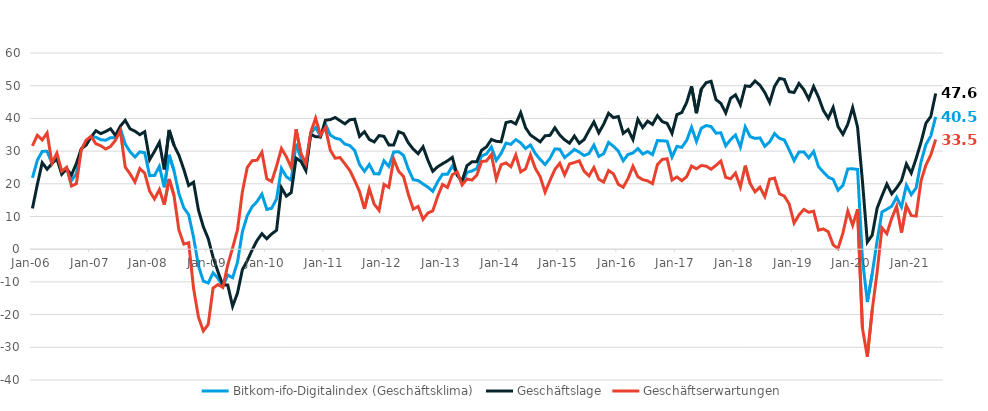
| Category | Bitkom-ifo-Digitalindex (Geschäftsklima) | Geschäftslage | Geschäftserwartungen |
|---|---|---|---|
| 2006-01-01 | 21.835 | 12.473 | 31.609 |
| 2006-02-01 | 27.19 | 19.772 | 34.858 |
| 2006-03-01 | 29.904 | 26.455 | 33.406 |
| 2006-04-01 | 29.942 | 24.458 | 35.56 |
| 2006-05-01 | 26.259 | 26.184 | 26.334 |
| 2006-06-01 | 28.531 | 27.687 | 29.379 |
| 2006-07-01 | 23.386 | 22.924 | 23.85 |
| 2006-08-01 | 24.801 | 24.56 | 25.043 |
| 2006-09-01 | 21.018 | 22.723 | 19.325 |
| 2006-10-01 | 23.101 | 26.219 | 20.027 |
| 2006-11-01 | 30.547 | 30.712 | 30.381 |
| 2006-12-01 | 32.579 | 31.825 | 33.335 |
| 2007-01-01 | 34.421 | 34.317 | 34.525 |
| 2007-02-01 | 34.228 | 36.231 | 32.242 |
| 2007-03-01 | 33.485 | 35.345 | 31.639 |
| 2007-04-01 | 33.302 | 35.999 | 30.636 |
| 2007-05-01 | 34.109 | 36.829 | 31.42 |
| 2007-06-01 | 34.046 | 34.776 | 33.318 |
| 2007-07-01 | 36.924 | 37.63 | 36.221 |
| 2007-08-01 | 32.166 | 39.412 | 25.14 |
| 2007-09-01 | 29.803 | 36.797 | 23.017 |
| 2007-10-01 | 28.191 | 36.088 | 20.559 |
| 2007-11-01 | 29.78 | 35.018 | 24.658 |
| 2007-12-01 | 29.488 | 35.916 | 23.236 |
| 2008-01-01 | 22.494 | 27.352 | 17.739 |
| 2008-02-01 | 22.526 | 29.926 | 15.364 |
| 2008-03-01 | 25.344 | 32.676 | 18.244 |
| 2008-04-01 | 18.934 | 24.405 | 13.597 |
| 2008-05-01 | 28.847 | 36.456 | 21.483 |
| 2008-06-01 | 23.96 | 31.775 | 16.409 |
| 2008-07-01 | 17.006 | 28.757 | 5.859 |
| 2008-08-01 | 12.678 | 24.421 | 1.55 |
| 2008-09-01 | 10.539 | 19.483 | 1.959 |
| 2008-10-01 | 3.619 | 20.493 | -11.963 |
| 2008-11-01 | -5.067 | 11.976 | -20.74 |
| 2008-12-01 | -9.739 | 6.87 | -25.014 |
| 2009-01-01 | -10.338 | 3.254 | -23.021 |
| 2009-02-01 | -7.23 | -2.468 | -11.877 |
| 2009-03-01 | -8.882 | -6.932 | -10.812 |
| 2009-04-01 | -11.3 | -10.911 | -11.689 |
| 2009-05-01 | -7.906 | -10.933 | -4.83 |
| 2009-06-01 | -8.735 | -17.455 | 0.401 |
| 2009-07-01 | -3.97 | -13.403 | 5.94 |
| 2009-08-01 | 5.319 | -6.24 | 17.567 |
| 2009-09-01 | 10.255 | -3.522 | 24.997 |
| 2009-10-01 | 12.984 | -0.229 | 27.071 |
| 2009-11-01 | 14.583 | 2.667 | 27.201 |
| 2009-12-01 | 16.845 | 4.732 | 29.675 |
| 2010-01-01 | 12.166 | 3.185 | 21.543 |
| 2010-02-01 | 12.529 | 4.662 | 20.7 |
| 2010-03-01 | 15.367 | 5.8 | 25.377 |
| 2010-04-01 | 24.722 | 18.815 | 30.788 |
| 2010-05-01 | 22.17 | 16.218 | 28.284 |
| 2010-06-01 | 21.112 | 17.296 | 24.996 |
| 2010-07-01 | 32.216 | 27.856 | 36.659 |
| 2010-08-01 | 28.032 | 26.828 | 29.243 |
| 2010-09-01 | 25.118 | 24.028 | 26.213 |
| 2010-10-01 | 35.434 | 35.137 | 35.732 |
| 2010-11-01 | 37.221 | 34.391 | 40.084 |
| 2010-12-01 | 34.585 | 34.329 | 34.841 |
| 2011-01-01 | 38.31 | 39.43 | 37.194 |
| 2011-02-01 | 34.934 | 39.635 | 30.325 |
| 2011-03-01 | 33.974 | 40.274 | 27.839 |
| 2011-04-01 | 33.595 | 39.307 | 28.019 |
| 2011-05-01 | 32.138 | 38.34 | 26.097 |
| 2011-06-01 | 31.713 | 39.578 | 24.106 |
| 2011-07-01 | 30.209 | 39.758 | 21.041 |
| 2011-08-01 | 25.887 | 34.498 | 17.592 |
| 2011-09-01 | 23.815 | 35.923 | 12.329 |
| 2011-10-01 | 25.903 | 33.569 | 18.488 |
| 2011-11-01 | 23.077 | 32.795 | 13.764 |
| 2011-12-01 | 23.019 | 34.75 | 11.875 |
| 2012-01-01 | 27.044 | 34.5 | 19.825 |
| 2012-02-01 | 25.307 | 31.893 | 18.908 |
| 2012-03-01 | 29.716 | 31.901 | 27.551 |
| 2012-04-01 | 29.81 | 35.935 | 23.844 |
| 2012-05-01 | 28.698 | 35.352 | 22.233 |
| 2012-06-01 | 24.483 | 32.505 | 16.738 |
| 2012-07-01 | 21.24 | 30.598 | 12.262 |
| 2012-08-01 | 21 | 29.224 | 13.07 |
| 2012-09-01 | 19.95 | 31.313 | 9.145 |
| 2012-10-01 | 18.99 | 27.207 | 11.07 |
| 2012-11-01 | 17.693 | 23.816 | 11.739 |
| 2012-12-01 | 20.636 | 25.215 | 16.151 |
| 2013-01-01 | 22.948 | 26.138 | 19.804 |
| 2013-02-01 | 22.902 | 27.01 | 18.867 |
| 2013-03-01 | 25.418 | 28.082 | 22.785 |
| 2013-04-01 | 23.115 | 22.597 | 23.634 |
| 2013-05-01 | 20.27 | 20.878 | 19.664 |
| 2013-06-01 | 23.5 | 25.543 | 21.476 |
| 2013-07-01 | 23.909 | 26.707 | 21.145 |
| 2013-08-01 | 24.647 | 26.736 | 22.578 |
| 2013-09-01 | 28.525 | 30.257 | 26.806 |
| 2013-10-01 | 29.136 | 31.304 | 26.989 |
| 2013-11-01 | 31.241 | 33.564 | 28.94 |
| 2013-12-01 | 27.155 | 33 | 21.457 |
| 2014-01-01 | 29.325 | 32.846 | 25.858 |
| 2014-02-01 | 32.46 | 38.717 | 26.367 |
| 2014-03-01 | 32.047 | 39.074 | 25.226 |
| 2014-04-01 | 33.516 | 38.313 | 28.817 |
| 2014-05-01 | 32.523 | 41.758 | 23.642 |
| 2014-06-01 | 30.781 | 37.156 | 24.577 |
| 2014-07-01 | 31.878 | 34.923 | 28.873 |
| 2014-08-01 | 29.255 | 33.889 | 24.713 |
| 2014-09-01 | 27.428 | 32.824 | 22.158 |
| 2014-10-01 | 25.899 | 34.682 | 17.444 |
| 2014-11-01 | 27.802 | 34.811 | 21.001 |
| 2014-12-01 | 30.66 | 37.128 | 24.368 |
| 2015-01-01 | 30.57 | 34.951 | 26.271 |
| 2015-02-01 | 28.035 | 33.465 | 22.731 |
| 2015-03-01 | 29.221 | 32.416 | 26.071 |
| 2015-04-01 | 30.515 | 34.605 | 26.497 |
| 2015-05-01 | 29.685 | 32.371 | 27.031 |
| 2015-06-01 | 28.631 | 33.541 | 23.824 |
| 2015-07-01 | 29.262 | 36.309 | 22.425 |
| 2015-08-01 | 31.844 | 38.923 | 24.975 |
| 2015-09-01 | 28.376 | 35.587 | 21.385 |
| 2015-10-01 | 29.21 | 38.228 | 20.535 |
| 2015-11-01 | 32.657 | 41.569 | 24.073 |
| 2015-12-01 | 31.469 | 40.224 | 23.034 |
| 2016-01-01 | 29.975 | 40.576 | 19.841 |
| 2016-02-01 | 27.038 | 35.423 | 18.952 |
| 2016-03-01 | 28.982 | 36.578 | 21.63 |
| 2016-04-01 | 29.421 | 33.541 | 25.374 |
| 2016-05-01 | 30.788 | 39.725 | 22.184 |
| 2016-06-01 | 29.094 | 37.202 | 21.263 |
| 2016-07-01 | 29.849 | 39.156 | 20.904 |
| 2016-08-01 | 28.92 | 38.156 | 20.042 |
| 2016-09-01 | 33.212 | 40.829 | 25.835 |
| 2016-10-01 | 33.159 | 39.01 | 27.451 |
| 2016-11-01 | 33.01 | 38.475 | 27.671 |
| 2016-12-01 | 28.172 | 35.434 | 21.134 |
| 2017-01-01 | 31.43 | 41.152 | 22.1 |
| 2017-02-01 | 31.14 | 41.807 | 20.944 |
| 2017-03-01 | 33.265 | 44.902 | 22.181 |
| 2017-04-01 | 37.294 | 49.79 | 25.423 |
| 2017-05-01 | 32.943 | 41.597 | 24.599 |
| 2017-06-01 | 36.999 | 48.969 | 25.605 |
| 2017-07-01 | 37.809 | 50.922 | 25.381 |
| 2017-08-01 | 37.53 | 51.352 | 24.469 |
| 2017-09-01 | 35.482 | 45.767 | 25.627 |
| 2017-10-01 | 35.61 | 44.592 | 26.957 |
| 2017-11-01 | 31.619 | 41.699 | 21.958 |
| 2017-12-01 | 33.525 | 46.15 | 21.548 |
| 2018-01-01 | 34.938 | 47.203 | 23.282 |
| 2018-02-01 | 31.247 | 44.159 | 19.017 |
| 2018-03-01 | 37.437 | 49.947 | 25.553 |
| 2018-04-01 | 34.443 | 49.775 | 20.052 |
| 2018-05-01 | 33.881 | 51.452 | 17.537 |
| 2018-06-01 | 34.036 | 50.148 | 18.962 |
| 2018-07-01 | 31.465 | 47.931 | 16.093 |
| 2018-08-01 | 32.834 | 44.84 | 21.416 |
| 2018-09-01 | 35.363 | 49.8 | 21.761 |
| 2018-10-01 | 33.915 | 52.235 | 16.926 |
| 2018-11-01 | 33.393 | 51.91 | 16.238 |
| 2018-12-01 | 30.363 | 48.169 | 13.835 |
| 2019-01-01 | 27.084 | 47.924 | 7.996 |
| 2019-02-01 | 29.7 | 50.677 | 10.478 |
| 2019-03-01 | 29.762 | 48.805 | 12.177 |
| 2019-04-01 | 27.943 | 45.916 | 11.284 |
| 2019-05-01 | 29.898 | 49.744 | 11.63 |
| 2019-06-01 | 25.241 | 46.489 | 5.824 |
| 2019-07-01 | 23.584 | 42.44 | 6.195 |
| 2019-08-01 | 22.033 | 40.08 | 5.343 |
| 2019-09-01 | 21.36 | 43.354 | 1.353 |
| 2019-10-01 | 18.036 | 37.503 | 0.165 |
| 2019-11-01 | 19.512 | 35.128 | 4.934 |
| 2019-12-01 | 24.55 | 38.236 | 11.65 |
| 2020-01-01 | 24.587 | 43.302 | 7.312 |
| 2020-02-01 | 24.399 | 37.323 | 12.179 |
| 2020-03-01 | -2.986 | 20.794 | -24.205 |
| 2020-04-01 | -16.167 | 2.179 | -32.848 |
| 2020-05-01 | -7.518 | 4.289 | -18.642 |
| 2020-06-01 | 2.486 | 12.515 | -7.07 |
| 2020-07-01 | 11.365 | 16.325 | 6.519 |
| 2020-08-01 | 12.195 | 19.901 | 4.76 |
| 2020-09-01 | 13.15 | 16.943 | 9.423 |
| 2020-10-01 | 15.899 | 18.743 | 13.091 |
| 2020-11-01 | 12.88 | 20.98 | 5.076 |
| 2020-12-01 | 19.605 | 26.082 | 13.313 |
| 2021-01-01 | 16.706 | 23.263 | 10.342 |
| 2021-02-01 | 18.772 | 27.758 | 10.14 |
| 2021-03-01 | 26.73 | 32.717 | 20.897 |
| 2021-04-01 | 32.027 | 38.525 | 25.707 |
| 2021-05-01 | 34.636 | 40.582 | 28.837 |
| 2021-06-01 | 40.484 | 47.644 | 33.532 |